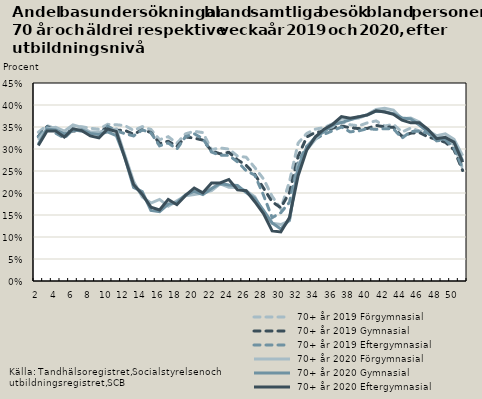
| Category |  70+ år |
|---|---|
| 2.0 | 0.308 |
| 3.0 | 0.341 |
| 4.0 | 0.341 |
| 5.0 | 0.327 |
| 6.0 | 0.346 |
| 7.0 | 0.342 |
| 8.0 | 0.33 |
| 9.0 | 0.325 |
| 10.0 | 0.345 |
| 11.0 | 0.34 |
| 12.0 | 0.279 |
| 13.0 | 0.219 |
| 14.0 | 0.197 |
| 15.0 | 0.168 |
| 16.0 | 0.162 |
| 17.0 | 0.185 |
| 18.0 | 0.173 |
| 19.0 | 0.194 |
| 20.0 | 0.211 |
| 21.0 | 0.201 |
| 22.0 | 0.223 |
| 23.0 | 0.223 |
| 24.0 | 0.231 |
| 25.0 | 0.207 |
| 26.0 | 0.205 |
| 27.0 | 0.18 |
| 28.0 | 0.153 |
| 29.0 | 0.114 |
| 30.0 | 0.111 |
| 31.0 | 0.144 |
| 32.0 | 0.239 |
| 33.0 | 0.298 |
| 34.0 | 0.328 |
| 35.0 | 0.345 |
| 36.0 | 0.356 |
| 37.0 | 0.374 |
| 38.0 | 0.37 |
| 39.0 | 0.373 |
| 40.0 | 0.378 |
| 41.0 | 0.387 |
| 42.0 | 0.384 |
| 43.0 | 0.379 |
| 44.0 | 0.365 |
| 45.0 | 0.359 |
| 46.0 | 0.359 |
| 47.0 | 0.344 |
| 48.0 | 0.323 |
| 49.0 | 0.326 |
| 50.0 | 0.315 |
| 51.0 | 0.27 |